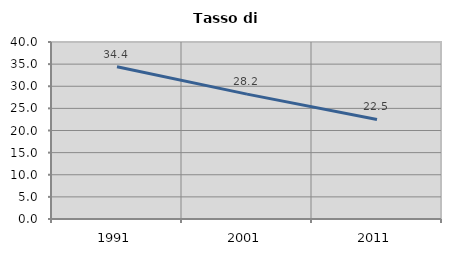
| Category | Tasso di disoccupazione   |
|---|---|
| 1991.0 | 34.393 |
| 2001.0 | 28.223 |
| 2011.0 | 22.492 |